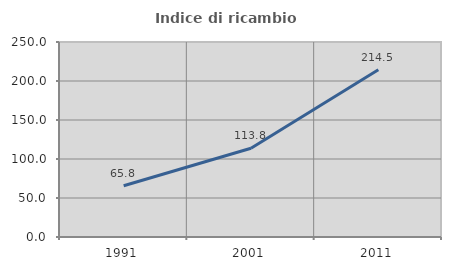
| Category | Indice di ricambio occupazionale  |
|---|---|
| 1991.0 | 65.785 |
| 2001.0 | 113.84 |
| 2011.0 | 214.451 |